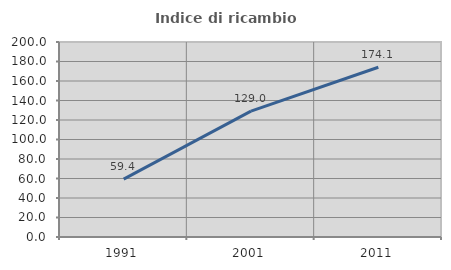
| Category | Indice di ricambio occupazionale  |
|---|---|
| 1991.0 | 59.42 |
| 2001.0 | 129.032 |
| 2011.0 | 174.074 |